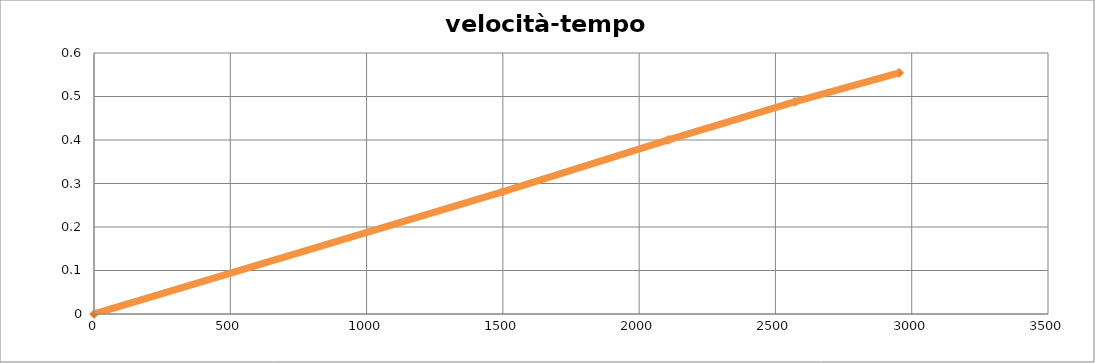
| Category | velocità-tempo 2 |
|---|---|
| 0.0 | 0 |
| 1498.16 | 0.281 |
| 2106.82 | 0.4 |
| 2572.52 | 0.488 |
| 2953.57 | 0.554 |